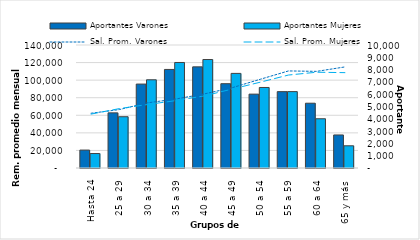
| Category | Aportantes Varones | Aportantes Mujeres |
|---|---|---|
| Hasta 24 | 1456 | 1176 |
| 25 a 29 | 4483 | 4169 |
| 30 a 34 | 6823 | 7172 |
| 35 a 39 | 8013 | 8579 |
| 40 a 44 | 8222 | 8819 |
| 45 a 49 | 6854 | 7691 |
| 50 a 54 | 6005 | 6547 |
| 55 a 59 | 6207 | 6210 |
| 60 a 64 | 5268 | 4004 |
| 65 y más | 2686 | 1806 |